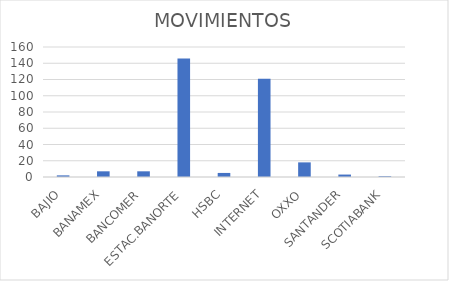
| Category | MOVIMIENTOS |
|---|---|
| BAJIO | 2 |
| BANAMEX | 7 |
| BANCOMER | 7 |
| ESTAC.BANORTE | 146 |
| HSBC | 5 |
| INTERNET | 121 |
| OXXO | 18 |
| SANTANDER | 3 |
| SCOTIABANK | 1 |